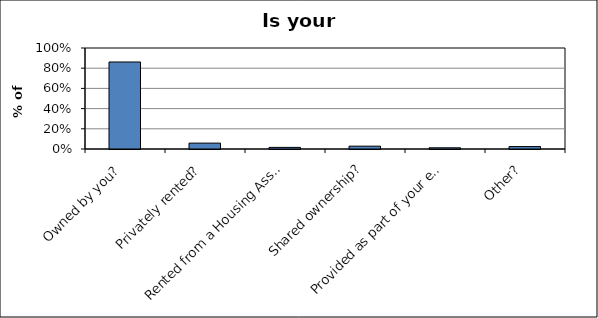
| Category | Series 0 |
|---|---|
| Owned by you? | 0.861 |
| Privately rented? | 0.058 |
| Rented from a Housing Association? | 0.016 |
| Shared ownership? | 0.028 |
| Provided as part of your employment? | 0.012 |
| Other? | 0.024 |